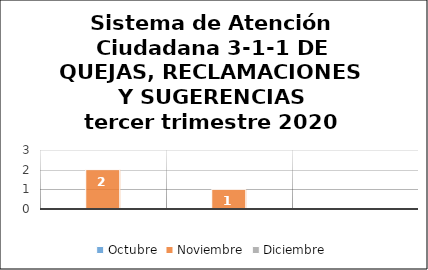
| Category | Octubre | Noviembre | Diciembre |
|---|---|---|---|
| Quejas | 0 | 2 | 0 |
| Reclamaciones | 0 | 1 | 0 |
| Sugerencias | 0 | 0 | 0 |